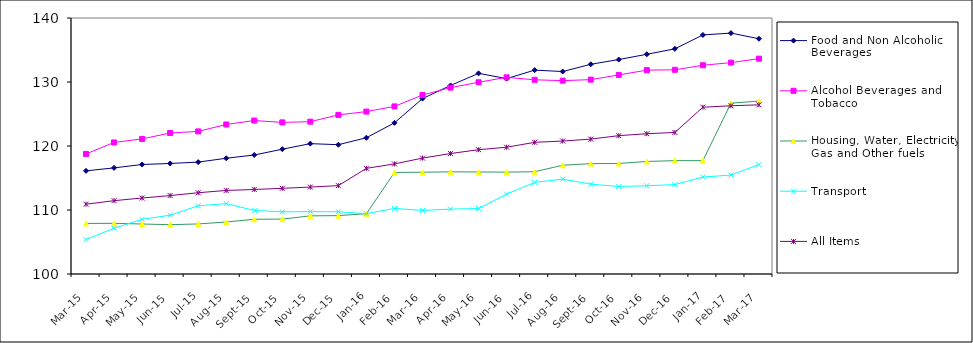
| Category | Food and Non Alcoholic Beverages | Alcohol Beverages and Tobacco | Housing, Water, Electricity, Gas and Other fuels | Transport | All Items  |
|---|---|---|---|---|---|
| 2015-03-01 | 116.12 | 118.76 | 107.901 | 105.386 | 110.906 |
| 2015-04-01 | 116.582 | 120.552 | 107.917 | 107.146 | 111.458 |
| 2015-05-01 | 117.112 | 121.107 | 107.812 | 108.548 | 111.873 |
| 2015-06-01 | 117.271 | 122.03 | 107.704 | 109.182 | 112.254 |
| 2015-07-01 | 117.484 | 122.282 | 107.821 | 110.66 | 112.699 |
| 2015-08-01 | 118.084 | 123.363 | 108.124 | 111 | 113.056 |
| 2015-09-01 | 118.596 | 123.979 | 108.552 | 109.926 | 113.205 |
| 2015-10-01 | 119.501 | 123.689 | 108.577 | 109.721 | 113.387 |
| 2015-11-01 | 120.368 | 123.804 | 109.085 | 109.744 | 113.581 |
| 2015-12-01 | 120.205 | 124.859 | 109.122 | 109.727 | 113.811 |
| 2016-01-01 | 121.29 | 125.378 | 109.423 | 109.421 | 116.507 |
| 2016-02-01 | 123.619 | 126.187 | 115.867 | 110.251 | 117.2 |
| 2016-03-01 | 127.409 | 127.97 | 115.907 | 109.932 | 118.108 |
| 2016-04-01 | 129.458 | 129.123 | 115.962 | 110.138 | 118.824 |
| 2016-05-01 | 131.348 | 129.958 | 115.945 | 110.226 | 119.421 |
| 2016-06-01 | 130.53 | 130.727 | 115.918 | 112.488 | 119.809 |
| 2016-07-01 | 131.856 | 130.344 | 115.984 | 114.308 | 120.576 |
| 2016-08-01 | 131.634 | 130.211 | 116.993 | 114.823 | 120.775 |
| 2016-09-01 | 132.768 | 130.37 | 117.248 | 114.035 | 121.078 |
| 2016-10-01 | 133.508 | 131.105 | 117.267 | 113.681 | 121.617 |
| 2016-11-01 | 134.333 | 131.852 | 117.586 | 113.793 | 121.917 |
| 2016-12-01 | 135.182 | 131.909 | 117.711 | 113.97 | 122.117 |
| 2017-01-01 | 137.353 | 132.615 | 117.708 | 115.147 | 126.058 |
| 2017-02-01 | 137.643 | 133.029 | 126.696 | 115.454 | 126.286 |
| 2017-03-01 | 136.76 | 133.649 | 127.024 | 117.105 | 126.434 |